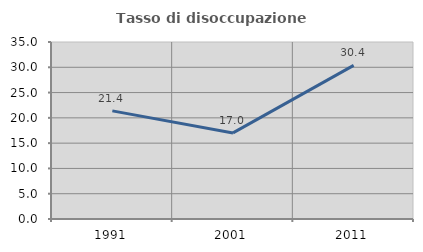
| Category | Tasso di disoccupazione giovanile  |
|---|---|
| 1991.0 | 21.384 |
| 2001.0 | 17.021 |
| 2011.0 | 30.38 |